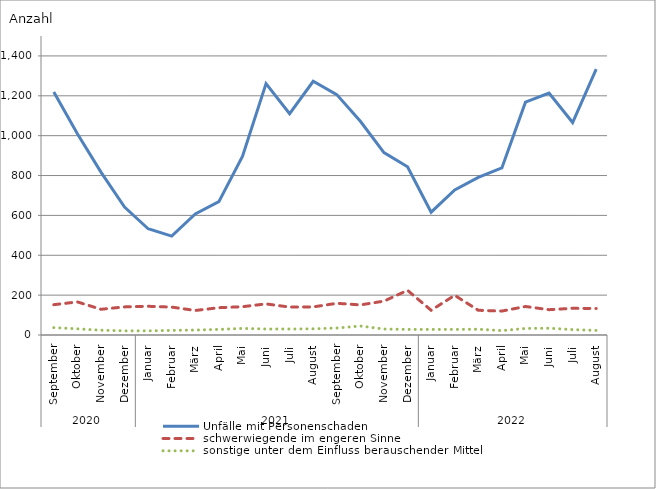
| Category | Unfälle mit Personenschaden | schwerwiegende im engeren Sinne | sonstige unter dem Einfluss berauschender Mittel |
|---|---|---|---|
| 0 | 1219 | 152 | 37 |
| 1 | 1010 | 166 | 31 |
| 2 | 817 | 129 | 24 |
| 3 | 642 | 141 | 21 |
| 4 | 533 | 144 | 21 |
| 5 | 496 | 140 | 23 |
| 6 | 607 | 123 | 25 |
| 7 | 669 | 137 | 28 |
| 8 | 896 | 142 | 33 |
| 9 | 1261 | 156 | 30 |
| 10 | 1110 | 140 | 30 |
| 11 | 1273 | 141 | 31 |
| 12 | 1206 | 159 | 35 |
| 13 | 1072 | 151 | 45 |
| 14 | 915 | 170 | 30 |
| 15 | 844 | 224 | 28 |
| 16 | 616 | 124 | 28 |
| 17 | 728 | 199 | 28 |
| 18 | 791 | 124 | 29 |
| 19 | 838 | 120 | 22 |
| 20 | 1168 | 143 | 33 |
| 21 | 1214 | 127 | 34 |
| 22 | 1066 | 134 | 27 |
| 23 | 1334 | 133 | 23 |